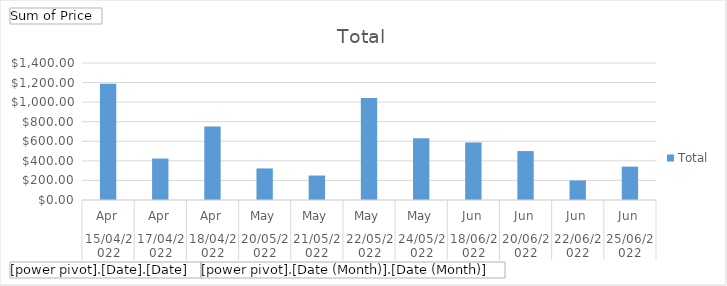
| Category | Total |
|---|---|
| 0 | 1187.86 |
| 1 | 423.58 |
| 2 | 750.5 |
| 3 | 322.56 |
| 4 | 250 |
| 5 | 1042.45 |
| 6 | 630 |
| 7 | 586.67 |
| 8 | 500 |
| 9 | 200 |
| 10 | 340.99 |